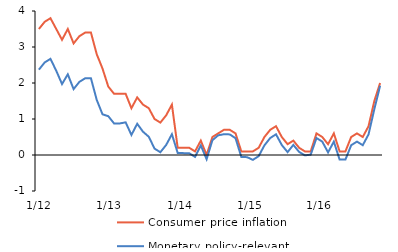
| Category | Consumer price inflation | Monetary policy-relevant inflation |
|---|---|---|
|  1/12 | 3.5 | 2.371 |
| 2 | 3.7 | 2.571 |
| 3 | 3.8 | 2.671 |
| 4 | 3.5 | 2.341 |
| 5 | 3.2 | 1.971 |
| 6 | 3.5 | 2.241 |
| 7 | 3.1 | 1.831 |
| 8 | 3.3 | 2.031 |
| 9 | 3.4 | 2.131 |
| 10 | 3.4 | 2.131 |
| 11 | 2.8 | 1.531 |
| 12 | 2.4 | 1.131 |
|  1/13 | 1.9 | 1.077 |
| 2 | 1.7 | 0.877 |
| 3 | 1.7 | 0.877 |
| 4 | 1.7 | 0.907 |
| 5 | 1.3 | 0.557 |
| 6 | 1.6 | 0.867 |
| 7 | 1.4 | 0.647 |
| 8 | 1.3 | 0.507 |
| 9 | 1 | 0.177 |
| 10 | 0.9 | 0.077 |
| 11 | 1.1 | 0.277 |
| 12 | 1.4 | 0.577 |
|   1/14 | 0.2 | 0.057 |
| 2 | 0.2 | 0.052 |
| 3 | 0.2 | 0.049 |
| 4 | 0.1 | -0.052 |
| 5 | 0.4 | 0.265 |
| 6 | 0 | -0.118 |
| 7 | 0.5 | 0.41 |
| 8 | 0.6 | 0.547 |
| 9 | 0.7 | 0.577 |
| 10 | 0.7 | 0.572 |
| 11 | 0.6 | 0.467 |
| 12 | 0.1 | -0.053 |
|   1/15 | 0.1 | -0.06 |
| 2 | 0.1 | -0.135 |
| 3 | 0.2 | -0.032 |
| 4 | 0.5 | 0.269 |
| 5 | 0.7 | 0.472 |
| 6 | 0.8 | 0.575 |
| 7 | 0.5 | 0.277 |
| 8 | 0.3 | 0.08 |
| 9 | 0.4 | 0.28 |
| 10 | 0.2 | 0.085 |
| 11 | 0.1 | -0.01 |
| 12 | 0.1 | 0.01 |
|   1/16 | 0.6 | 0.472 |
| 2 | 0.5 | 0.372 |
| 3 | 0.3 | 0.072 |
| 4 | 0.6 | 0.372 |
| 5 | 0.1 | -0.128 |
| 6 | 0.1 | -0.128 |
| 7 | 0.5 | 0.272 |
| 8 | 0.6 | 0.372 |
| 9 | 0.5 | 0.272 |
| 10 | 0.8 | 0.572 |
| 11 | 1.5 | 1.272 |
| 12 | 2 | 1.923 |